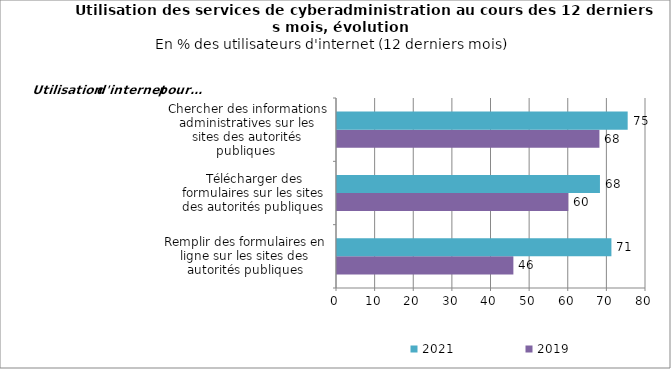
| Category | 2019 | 2021 |
|---|---|---|
| Remplir des formulaires en ligne sur les sites des autorités publiques | 45.664 | 71.046 |
| Télécharger des formulaires sur les sites des autorités publiques  | 59.885 | 68.078 |
| Chercher des informations administratives sur les sites des autorités publiques  | 67.94 | 75.256 |